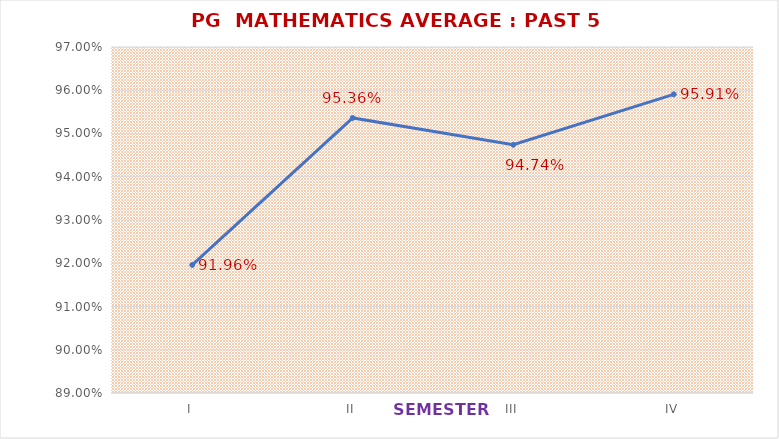
| Category | PG  MATHEMATICS |
|---|---|
| I | 0.92 |
| II | 0.954 |
| III | 0.947 |
| IV | 0.959 |